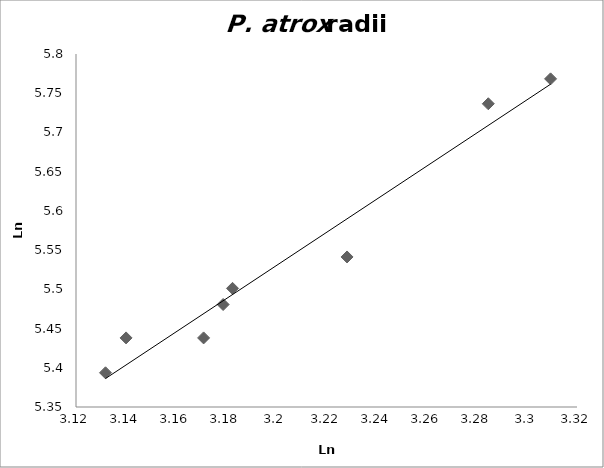
| Category | Series 0 |
|---|---|
| 3.131783032261764 | 5.394 |
| 3.284580416566671 | 5.737 |
| 3.178733005369492 | 5.481 |
| 3.228201485747401 | 5.541 |
| 3.182488150984303 | 5.501 |
| 3.309458177714649 | 5.768 |
| 3.170937249667087 | 5.438 |
| 3.139990789859718 | 5.438 |